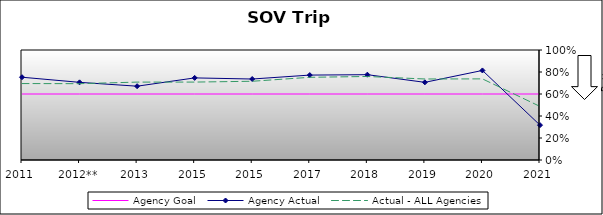
| Category | Agency Goal | Agency Actual | Actual - ALL Agencies |
|---|---|---|---|
| 2011 | 0.6 | 0.752 | 0.695 |
| 2012** | 0.6 | 0.706 | 0.694 |
| 2013 | 0.6 | 0.671 | 0.708 |
| 2015 | 0.6 | 0.746 | 0.708 |
| 2015 | 0.6 | 0.736 | 0.716 |
| 2017 | 0.6 | 0.772 | 0.752 |
| 2018 | 0.6 | 0.776 | 0.759 |
| 2019 | 0.6 | 0.706 | 0.736 |
| 2020 | 0.6 | 0.814 | 0.737 |
| 2021 | 0.6 | 0.317 | 0.487 |